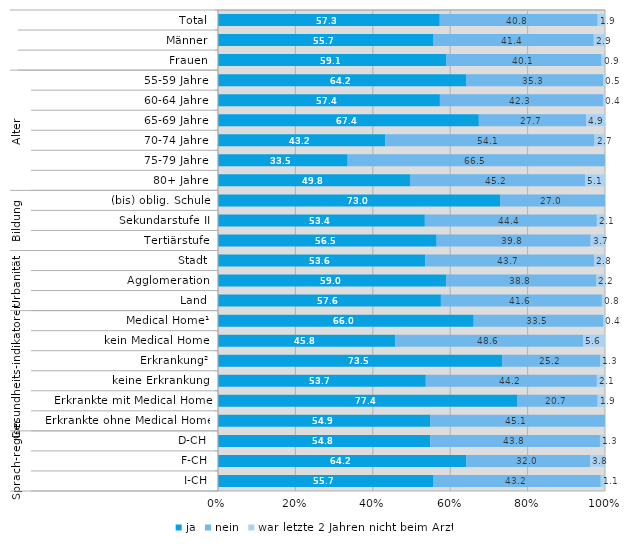
| Category | ja | nein | war letzte 2 Jahren nicht beim Arzt |
|---|---|---|---|
| 0 | 57.3 | 40.8 | 1.9 |
| 1 | 55.7 | 41.4 | 2.9 |
| 2 | 59.1 | 40.1 | 0.9 |
| 3 | 64.2 | 35.3 | 0.5 |
| 4 | 57.4 | 42.3 | 0.4 |
| 5 | 67.4 | 27.7 | 4.9 |
| 6 | 43.2 | 54.1 | 2.7 |
| 7 | 33.5 | 66.5 | 0 |
| 8 | 49.8 | 45.2 | 5.1 |
| 9 | 73 | 27 | 0 |
| 10 | 53.4 | 44.4 | 2.1 |
| 11 | 56.5 | 39.8 | 3.7 |
| 12 | 53.6 | 43.7 | 2.8 |
| 13 | 59 | 38.8 | 2.2 |
| 14 | 57.6 | 41.6 | 0.8 |
| 15 | 66 | 33.5 | 0.4 |
| 16 | 45.8 | 48.6 | 5.6 |
| 17 | 73.5 | 25.2 | 1.3 |
| 18 | 53.7 | 44.2 | 2.1 |
| 19 | 77.4 | 20.7 | 1.9 |
| 20 | 54.9 | 45.1 | 0 |
| 21 | 54.8 | 43.8 | 1.3 |
| 22 | 64.2 | 32 | 3.8 |
| 23 | 55.7 | 43.2 | 1.1 |